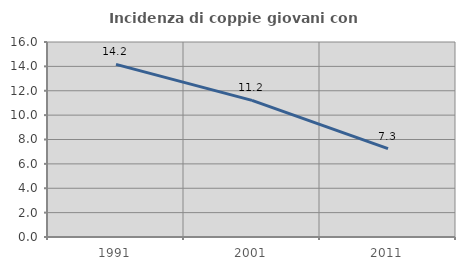
| Category | Incidenza di coppie giovani con figli |
|---|---|
| 1991.0 | 14.161 |
| 2001.0 | 11.207 |
| 2011.0 | 7.258 |